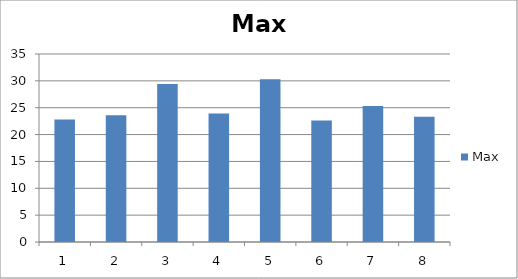
| Category | Max |
|---|---|
| 0 | 22.8 |
| 1 | 23.6 |
| 2 | 29.4 |
| 3 | 23.9 |
| 4 | 30.3 |
| 5 | 22.6 |
| 6 | 25.3 |
| 7 | 23.3 |